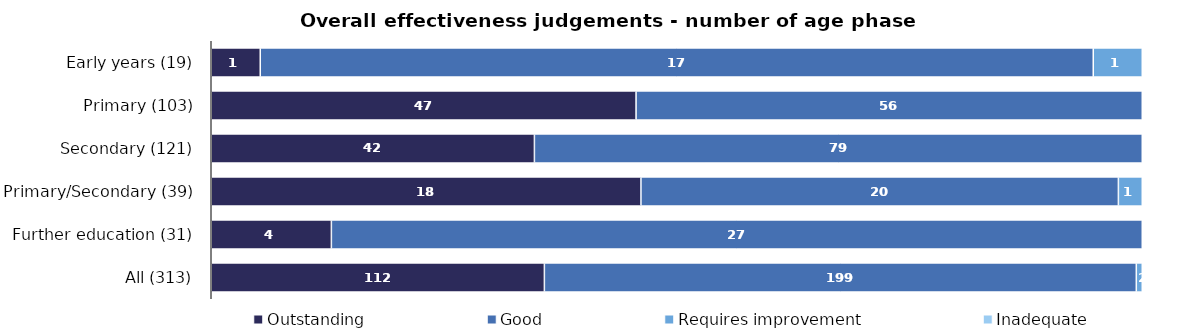
| Category | Outstanding | Good | Requires improvement | Inadequate |
|---|---|---|---|---|
| Early years (19) | 1 | 17 | 1 | 0 |
| Primary (103) | 47 | 56 | 0 | 0 |
| Secondary (121) | 42 | 79 | 0 | 0 |
| Primary/Secondary (39) | 18 | 20 | 1 | 0 |
| Further education (31) | 4 | 27 | 0 | 0 |
| All (313) | 112 | 199 | 2 | 0 |